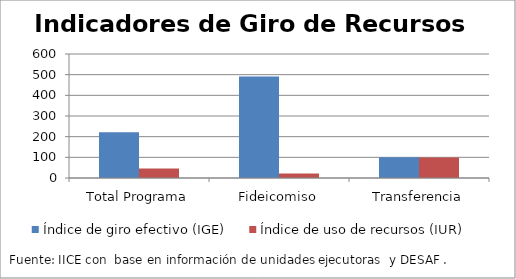
| Category | Índice de giro efectivo (IGE) | Índice de uso de recursos (IUR)  |
|---|---|---|
| Total Programa | 221.249 | 46.002 |
| Fideicomiso | 490.556 | 21.997 |
| Transferencia | 100 | 99.02 |